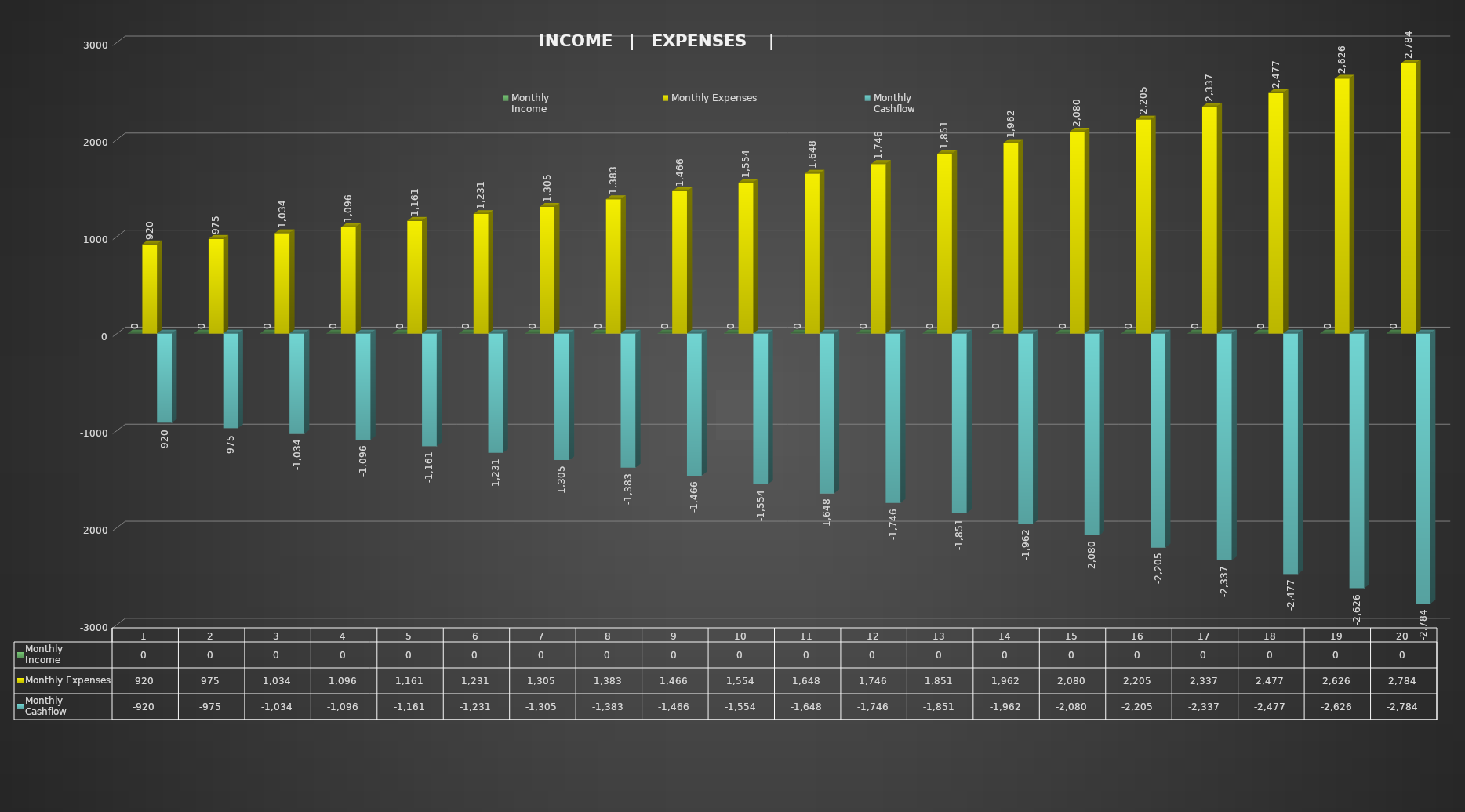
| Category | Monthly
Income | Monthly Expenses | Monthly
Cashflow |
|---|---|---|---|
| 0 | 0 | 920 | -920 |
| 1 | 0 | 975.2 | -975.2 |
| 2 | 0 | 1033.712 | -1033.712 |
| 3 | 0 | 1095.735 | -1095.735 |
| 4 | 0 | 1161.479 | -1161.479 |
| 5 | 0 | 1231.168 | -1231.168 |
| 6 | 0 | 1305.038 | -1305.038 |
| 7 | 0 | 1383.34 | -1383.34 |
| 8 | 0 | 1466.34 | -1466.34 |
| 9 | 0 | 1554.321 | -1554.321 |
| 10 | 0 | 1647.58 | -1647.58 |
| 11 | 0 | 1746.435 | -1746.435 |
| 12 | 0 | 1851.221 | -1851.221 |
| 13 | 0 | 1962.294 | -1962.294 |
| 14 | 0 | 2080.032 | -2080.032 |
| 15 | 0 | 2204.834 | -2204.834 |
| 16 | 0 | 2337.124 | -2337.124 |
| 17 | 0 | 2477.351 | -2477.351 |
| 18 | 0 | 2625.992 | -2625.992 |
| 19 | 0 | 2783.552 | -2783.552 |